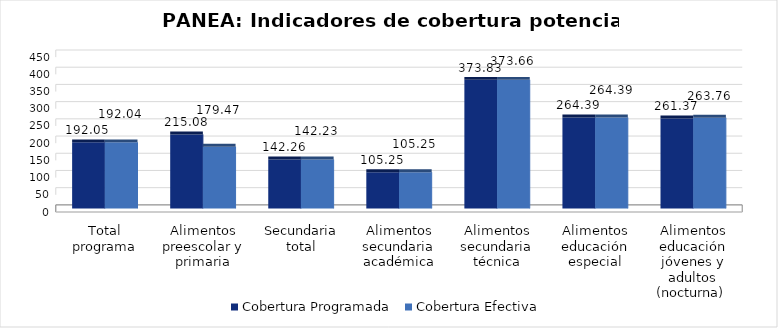
| Category | Cobertura Programada | Cobertura Efectiva |
|---|---|---|
| Total programa | 192.054 | 192.038 |
| Alimentos preescolar y primaria | 215.077 | 179.466 |
| Secundaria total | 142.256 | 142.233 |
| Alimentos secundaria académica | 105.246 | 105.246 |
| Alimentos secundaria técnica | 373.828 | 373.664 |
| Alimentos educación especial | 264.387 | 264.387 |
| Alimentos educación jóvenes y adultos (nocturna)  | 261.374 | 263.758 |